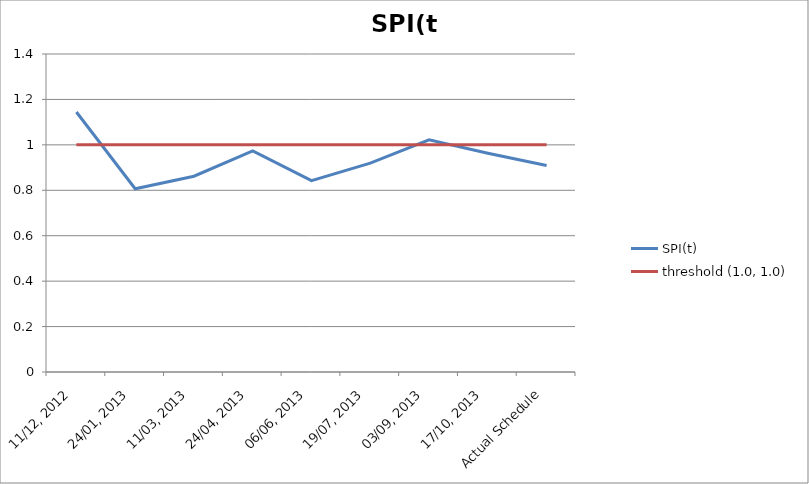
| Category | SPI(t) | threshold (1.0, 1.0) |
|---|---|---|
| 11/12, 2012 | 1.145 | 1 |
| 24/01, 2013 | 0.807 | 1 |
| 11/03, 2013 | 0.862 | 1 |
| 24/04, 2013 | 0.974 | 1 |
| 06/06, 2013 | 0.843 | 1 |
| 19/07, 2013 | 0.92 | 1 |
| 03/09, 2013 | 1.022 | 1 |
| 17/10, 2013 | 0.963 | 1 |
| Actual Schedule | 0.909 | 1 |